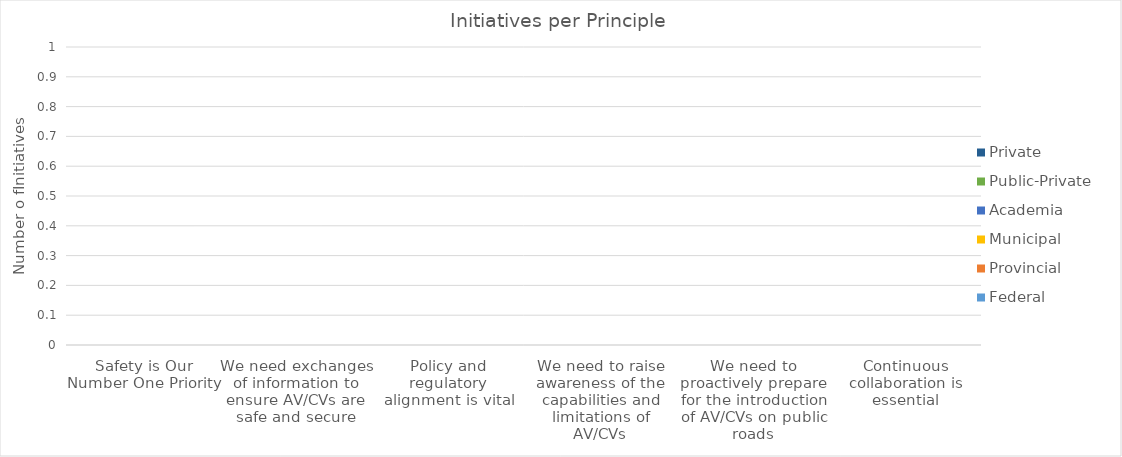
| Category | Federal | Provincial | Municipal | Academia | Public-Private | Private |
|---|---|---|---|---|---|---|
| Safety is Our Number One Priority | 0 | 0 | 0 | 0 | 0 | 0 |
| We need exchanges of information to ensure AV/CVs are safe and secure | 0 | 0 | 0 | 0 | 0 | 0 |
| Policy and regulatory alignment is vital | 0 | 0 | 0 | 0 | 0 | 0 |
| We need to raise awareness of the capabilities and limitations of AV/CVs | 0 | 0 | 0 | 0 | 0 | 0 |
| We need to proactively prepare for the introduction of AV/CVs on public roads | 0 | 0 | 0 | 0 | 0 | 0 |
| Continuous collaboration is essential | 0 | 0 | 0 | 0 | 0 | 0 |